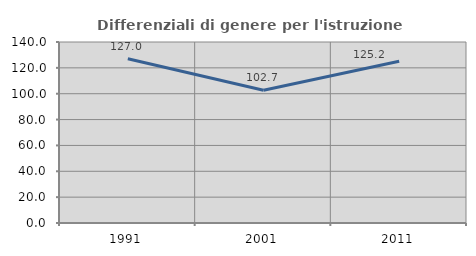
| Category | Differenziali di genere per l'istruzione superiore |
|---|---|
| 1991.0 | 126.979 |
| 2001.0 | 102.664 |
| 2011.0 | 125.179 |